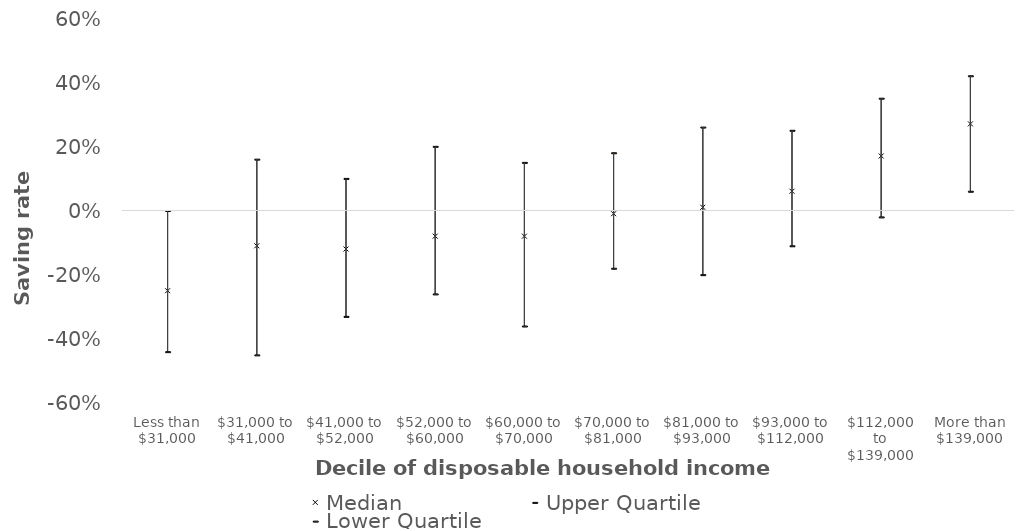
| Category | Median | Upper Quartile | Lower Quartile |
|---|---|---|---|
| Less than $31,000 | -0.25 | 0 | -0.44 |
| $31,000 to $41,000 | -0.11 | 0.16 | -0.45 |
| $41,000 to $52,000 | -0.12 | 0.1 | -0.33 |
| $52,000 to $60,000 | -0.08 | 0.2 | -0.26 |
| $60,000 to $70,000 | -0.08 | 0.15 | -0.36 |
| $70,000 to $81,000 | -0.01 | 0.18 | -0.18 |
| $81,000 to $93,000 | 0.01 | 0.26 | -0.2 |
| $93,000 to $112,000 | 0.06 | 0.25 | -0.11 |
| $112,000 to $139,000 | 0.17 | 0.35 | -0.02 |
| More than $139,000 | 0.27 | 0.42 | 0.06 |